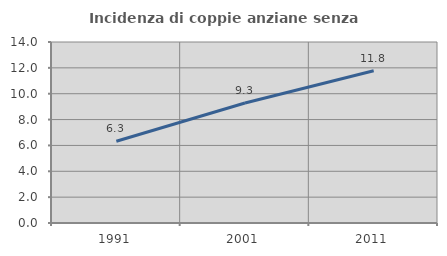
| Category | Incidenza di coppie anziane senza figli  |
|---|---|
| 1991.0 | 6.318 |
| 2001.0 | 9.284 |
| 2011.0 | 11.774 |